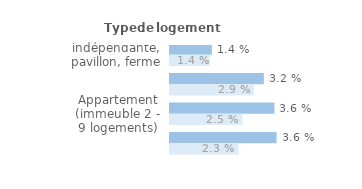
| Category | Series 1 | Series 0 |
|---|---|---|
| Maison indépendante, pavillon, ferme | 0.014 | 0.014 |
| Maison de ville groupée | 0.032 | 0.029 |
| Appartement (immeuble 2 - 9 logements) | 0.036 | 0.025 |
| Appartement (immeuble de 10 logements ou +) | 0.036 | 0.023 |